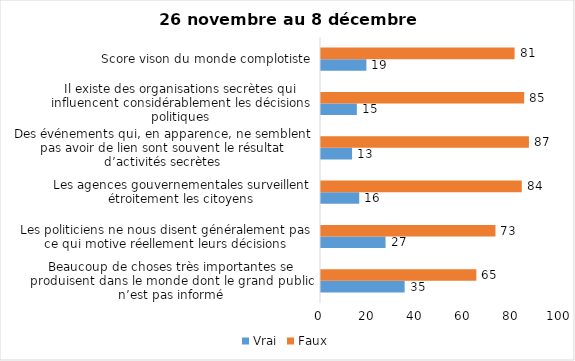
| Category | Vrai | Faux |
|---|---|---|
| Beaucoup de choses très importantes se produisent dans le monde dont le grand public n’est pas informé | 35 | 65 |
| Les politiciens ne nous disent généralement pas ce qui motive réellement leurs décisions | 27 | 73 |
| Les agences gouvernementales surveillent étroitement les citoyens | 16 | 84 |
| Des événements qui, en apparence, ne semblent pas avoir de lien sont souvent le résultat d’activités secrètes | 13 | 87 |
| Il existe des organisations secrètes qui influencent considérablement les décisions politiques | 15 | 85 |
| Score vison du monde complotiste | 19 | 81 |